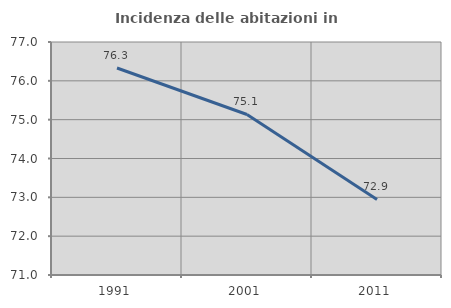
| Category | Incidenza delle abitazioni in proprietà  |
|---|---|
| 1991.0 | 76.331 |
| 2001.0 | 75.134 |
| 2011.0 | 72.947 |